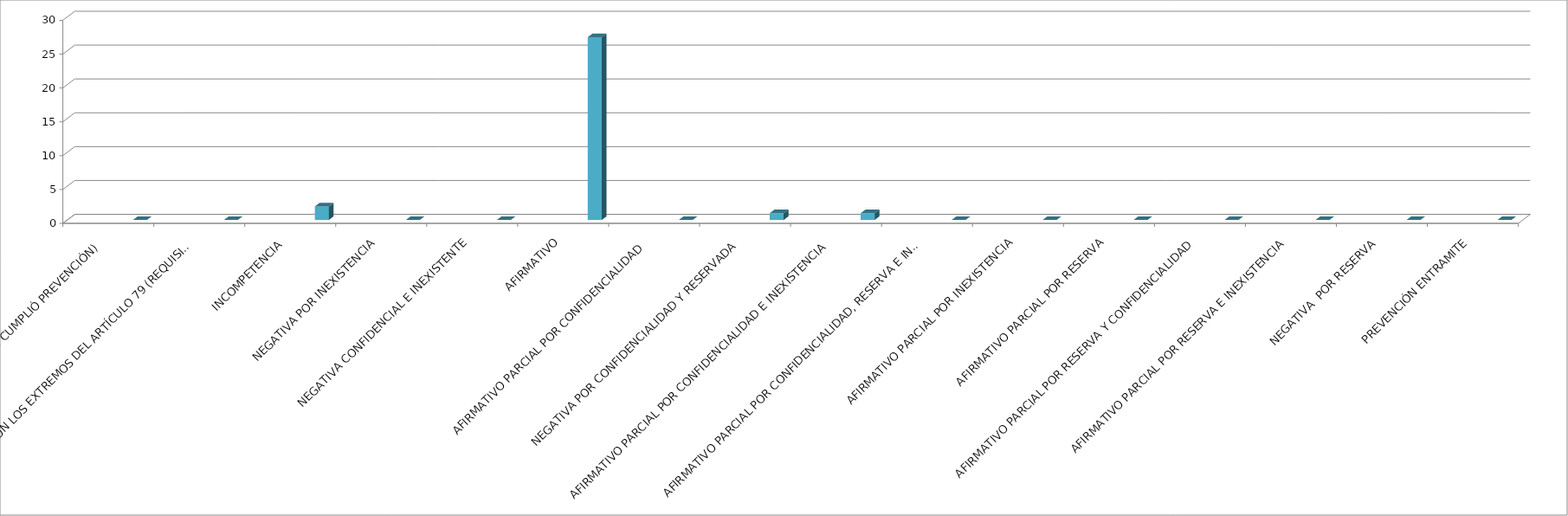
| Category | Series 0 | Series 1 | Series 2 | Series 3 | Series 4 |
|---|---|---|---|---|---|
| SE TIENE POR NO PRESENTADA ( NO CUMPLIÓ PREVENCIÓN) |  |  |  |  | 0 |
| NO CUMPLIO CON LOS EXTREMOS DEL ARTÍCULO 79 (REQUISITOS) |  |  |  |  | 0 |
| INCOMPETENCIA  |  |  |  |  | 2 |
| NEGATIVA POR INEXISTENCIA |  |  |  |  | 0 |
| NEGATIVA CONFIDENCIAL E INEXISTENTE |  |  |  |  | 0 |
| AFIRMATIVO |  |  |  |  | 27 |
| AFIRMATIVO PARCIAL POR CONFIDENCIALIDAD  |  |  |  |  | 0 |
| NEGATIVA POR CONFIDENCIALIDAD Y RESERVADA |  |  |  |  | 1 |
| AFIRMATIVO PARCIAL POR CONFIDENCIALIDAD E INEXISTENCIA |  |  |  |  | 1 |
| AFIRMATIVO PARCIAL POR CONFIDENCIALIDAD, RESERVA E INEXISTENCIA |  |  |  |  | 0 |
| AFIRMATIVO PARCIAL POR INEXISTENCIA |  |  |  |  | 0 |
| AFIRMATIVO PARCIAL POR RESERVA |  |  |  |  | 0 |
| AFIRMATIVO PARCIAL POR RESERVA Y CONFIDENCIALIDAD |  |  |  |  | 0 |
| AFIRMATIVO PARCIAL POR RESERVA E INEXISTENCIA |  |  |  |  | 0 |
| NEGATIVA  POR RESERVA |  |  |  |  | 0 |
| PREVENCIÓN ENTRAMITE |  |  |  |  | 0 |